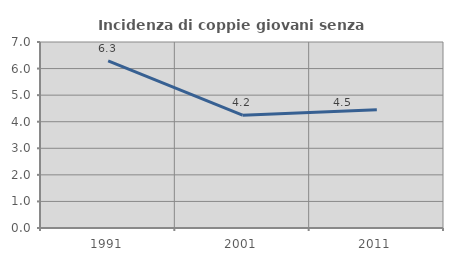
| Category | Incidenza di coppie giovani senza figli |
|---|---|
| 1991.0 | 6.29 |
| 2001.0 | 4.245 |
| 2011.0 | 4.452 |